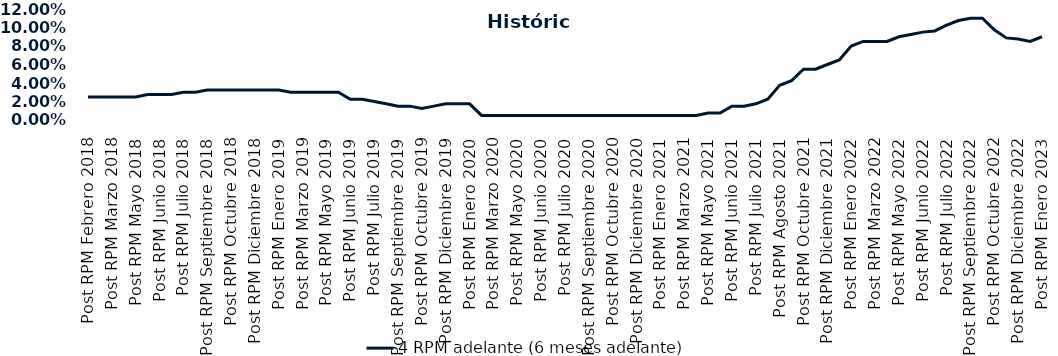
| Category | 4 RPM adelante (6 meses adelante) |
|---|---|
| Post RPM Febrero 2018 | 0.025 |
| Pre RPM Marzo 2018 | 0.025 |
| Post RPM Marzo 2018 | 0.025 |
| Pre RPM Mayo 2018 | 0.025 |
| Post RPM Mayo 2018 | 0.025 |
| Pre RPM Junio 2018 | 0.028 |
| Post RPM Junio 2018 | 0.028 |
| Pre RPM Julio 2018 | 0.028 |
| Post RPM Julio 2018 | 0.03 |
| Pre RPM Septiembre 2018 | 0.03 |
| Post RPM Septiembre 2018 | 0.032 |
| Pre RPM Octubre 2018 | 0.032 |
| Post RPM Octubre 2018 | 0.032 |
| Pre RPM Diciembre 2018 | 0.032 |
| Post RPM Diciembre 2018 | 0.032 |
| Pre RPM Enero 2019 | 0.032 |
| Post RPM Enero 2019 | 0.032 |
| Pre RPM Marzo 2019 | 0.03 |
| Post RPM Marzo 2019 | 0.03 |
| Pre RPM Mayo 2019 | 0.03 |
| Post RPM Mayo 2019 | 0.03 |
| Pre RPM Junio 2019 | 0.03 |
| Post RPM Junio 2019 | 0.022 |
| Pre RPM Julio 2019 | 0.022 |
| Post RPM Julio 2019 | 0.02 |
| Pre RPM Septiembre 2019 | 0.018 |
| Post RPM Septiembre 2019 | 0.015 |
| Pre RPM Octubre 2019 | 0.015 |
| Post RPM Octubre 2019 | 0.012 |
| Pre RPM Diciembre 2019 | 0.015 |
| Post RPM Diciembre 2019 | 0.018 |
| Pre RPM Enero 2020 | 0.018 |
| Post RPM Enero 2020 | 0.018 |
| Pre RPM Marzo 2020 | 0.005 |
| Post RPM Marzo 2020 | 0.005 |
| Pre RPM Mayo 2020 | 0.005 |
| Post RPM Mayo 2020 | 0.005 |
| Pre RPM Junio 2020 | 0.005 |
| Post RPM Junio 2020 | 0.005 |
| Pre RPM Julio 2020 | 0.005 |
| Post RPM Julio 2020 | 0.005 |
| Pre RPM Septiembre 2020 | 0.005 |
| Post RPM Septiembre 2020 | 0.005 |
| Pre RPM Octubre 2020 | 0.005 |
| Post RPM Octubre 2020 | 0.005 |
| Pre RPM Diciembre 2020 | 0.005 |
| Post RPM Diciembre 2020 | 0.005 |
| Pre RPM Enero 2021 | 0.005 |
| Post RPM Enero 2021 | 0.005 |
| Pre RPM Marzo 2021 | 0.005 |
| Post RPM Marzo 2021 | 0.005 |
| Pre RPM Mayo 2021 | 0.005 |
| Post RPM Mayo 2021 | 0.008 |
| Pre RPM Junio 2021 | 0.008 |
| Post RPM Junio 2021 | 0.015 |
| Pre RPM Julio 2021 | 0.015 |
| Post RPM Julio 2021 | 0.018 |
| Pre RPM Agosto 2021 | 0.022 |
| Post RPM Agosto 2021 | 0.038 |
| Pre RPM Octubre 2021 | 0.042 |
| Post RPM Octubre 2021 | 0.055 |
| Pre RPM Diciembre 2021 | 0.055 |
| Post RPM Diciembre 2021 | 0.06 |
| Pre RPM Enero 2022 | 0.065 |
| Post RPM Enero 2022 | 0.08 |
| Pre RPM Marzo 2022 | 0.085 |
| Post RPM Marzo 2022 | 0.085 |
| Pre RPM Mayo 2022 | 0.085 |
| Post RPM Mayo 2022 | 0.09 |
| Pre RPM Junio 2022 | 0.092 |
| Post RPM Junio 2022 | 0.095 |
| Pre RPM Julio 2022 | 0.096 |
| Post RPM Julio 2022 | 0.102 |
| Pre RPM Septiembre 2022 | 0.108 |
| Post RPM Septiembre 2022 | 0.11 |
| Pre RPM Octubre 2022 | 0.11 |
| Post RPM Octubre 2022 | 0.098 |
| Pre RPM Diciembre 2022 | 0.089 |
| Post RPM Diciembre 2022 | 0.088 |
| Pre RPM Enero 2023 | 0.085 |
| Post RPM Enero 2023 | 0.09 |